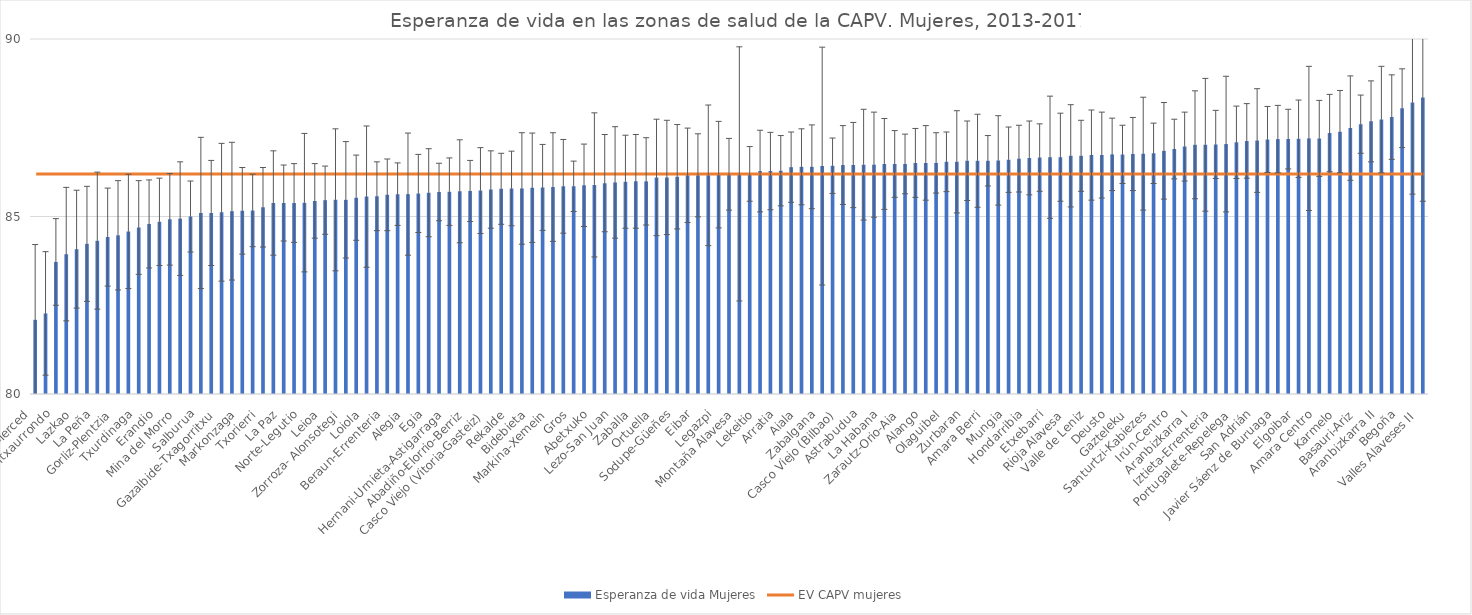
| Category | Esperanza de vida Mujeres |
|---|---|
| La Merced  | 82.09 |
| Miribilla  | 82.27 |
| Intxaurrondo  | 83.72 |
| Otxarkoaga  | 83.94 |
| Lazkao  | 84.08 |
| Torrekua  | 84.23 |
| La Peña  | 84.32 |
| Santurtzi-Centro-Mamariga  | 84.42 |
| Gorliz-Plentzia  | 84.47 |
| Kueto  | 84.58 |
| Txurdinaga  | 84.69 |
| Zuazo  | 84.79 |
| Erandio  | 84.85 |
| Portugalete-Buenavista  | 84.92 |
| Mina del Morro  | 84.94 |
| Zumaia-Zestoa-Getaria  | 85 |
| Salburua  | 85.1 |
| Zalla  | 85.1 |
| Gazalbide-Txagorritxu  | 85.12 |
| Lutxana  | 85.15 |
| Markonzaga  | 85.16 |
| Abanto-Muskiz  | 85.17 |
| Txorierri  | 85.26 |
| Balmaseda  | 85.38 |
| La Paz  | 85.38 |
| Alza-Roteta  | 85.38 |
| Norte-Legutio  | 85.39 |
| Bermeo  | 85.44 |
| Leioa  | 85.46 |
| Urban  | 85.47 |
| Zorroza- Alonsotegi  | 85.47 |
| Ordizia  | 85.53 |
| Loiola  | 85.56 |
| Sopelana  | 85.57 |
| Beraun-Errenteria  | 85.61 |
| San Vicente  | 85.63 |
| Alegia  | 85.63 |
| Amorebieta  | 85.65 |
| Egia  | 85.67 |
| Durango  | 85.69 |
| Hernani-Urnieta-Astigarraga  | 85.7 |
| Oiartzun  | 85.71 |
| Abadiño-Elorrio-Berriz  | 85.72 |
| Rontegi  | 85.73 |
| Casco Viejo (Vitoria-Gasteiz)  | 85.76 |
| Basurto  | 85.78 |
| Rekalde  | 85.79 |
| Deba  | 85.79 |
| Bidebieta  | 85.81 |
| Azkoitia  | 85.82 |
| Markina-Xemein  | 85.83 |
| Andoain  | 85.85 |
| Gros  | 85.85 |
| Tolosa  | 85.88 |
| Abetxuko  | 85.89 |
| Basauri-Kareaga  | 85.94 |
| Lezo-San Juan  | 85.96 |
| Lakuabizkarra  | 85.98 |
| Zaballa  | 85.99 |
| Arrigorriaga  | 85.99 |
| Ortuella  | 86.1 |
| Santutxu-Solokoetxe  | 86.1 |
| Sodupe-Güeñes  | 86.12 |
| Trapagaran  | 86.16 |
| Eibar  | 86.16 |
| Pasaia Antxo  | 86.16 |
| Legazpi  | 86.18 |
| Dumboa  | 86.19 |
| Montaña Alavesa  | 86.2 |
| Bombero Etxaniz  | 86.2 |
| Lekeitio  | 86.28 |
| Ondarroa  | 86.28 |
| Arratia  | 86.29 |
| Gernika  | 86.39 |
| Aiala  | 86.4 |
| Gernikaldea  | 86.4 |
| Zabalgana  | 86.42 |
| Las Arenas  | 86.43 |
| Casco Viejo (Bilbao)  | 86.45 |
| Parte Vieja  | 86.45 |
| Astrabudua  | 86.46 |
| Ibarra  | 86.46 |
| La Habana  | 86.48 |
| Llodio  | 86.48 |
| Zarautz-Orio-Aia  | 86.48 |
| Portugalete-Castaños  | 86.51 |
| Alango  | 86.51 |
| Ondarreta  | 86.51 |
| Olaguibel  | 86.54 |
| Azpeitia  | 86.54 |
| Zurbaran  | 86.57 |
| Zumarraga  | 86.57 |
| Amara Berri  | 86.57 |
| Ermua  | 86.58 |
| Mungia  | 86.6 |
| Beasain  | 86.63 |
| Hondarribia  | 86.65 |
| San Martín  | 86.66 |
| Etxebarri  | 86.67 |
| Pasaia San Pedro  | 86.67 |
| Rioja Alavesa  | 86.71 |
| Arrasate  | 86.71 |
| Valle de Leniz  | 86.73 |
| Villabona  | 86.73 |
| Deusto  | 86.75 |
| Galdakao  | 86.75 |
| Gazteleku  | 86.76 |
| Zaramaga  | 86.77 |
| Santurtzi-Kabiezes  | 86.78 |
| Llanada Alavesa  | 86.85 |
| Irún-Centro  | 86.9 |
| Lasarte-Usurbil  | 86.97 |
| Aranbizkarra I  | 87.02 |
| Lakua-Arriaga  | 87.02 |
| Iztieta-Errenteria  | 87.03 |
| Sansomendi  | 87.04 |
| Portugalete-Repelega  | 87.09 |
| Indautxu  | 87.13 |
| San Adrián  | 87.14 |
| San Ignacio  | 87.17 |
| Javier Sáenz de Buruaga  | 87.18 |
| Algorta  | 87.18 |
| Elgoibar  | 87.19 |
| Norte-Zuia  | 87.2 |
| Amara Centro  | 87.2 |
| Bergara  | 87.35 |
| Karmelo  | 87.39 |
| Bolueta-Sagarminaga  | 87.49 |
| Basauri-Ariz  | 87.6 |
| Oñati  | 87.68 |
| Aranbizkarra II  | 87.73 |
| Olarizu  | 87.8 |
| Begoña  | 88.05 |
| Valles Alaveses I  | 88.21 |
| Valles Alaveses II  | 88.35 |